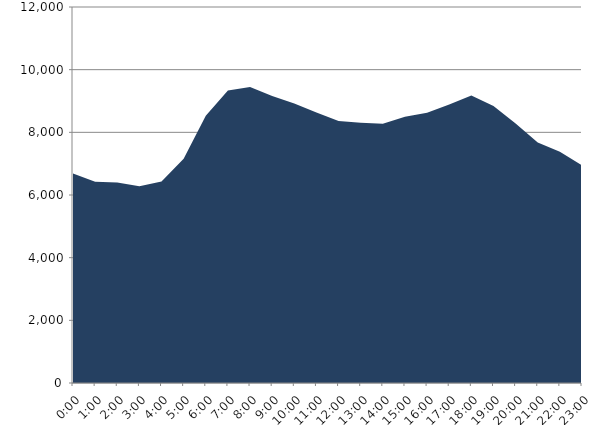
| Category | Series 0 | Series 1 |
|---|---|---|
| 2023-10-18 |  | 6684.831 |
| 2023-10-18 01:00:00 |  | 6426.607 |
| 2023-10-18 02:00:00 |  | 6401.383 |
| 2023-10-18 03:00:00 |  | 6275.612 |
| 2023-10-18 04:00:00 |  | 6433.527 |
| 2023-10-18 05:00:00 |  | 7155.216 |
| 2023-10-18 06:00:00 |  | 8527.05 |
| 2023-10-18 07:00:00 |  | 9336.054 |
| 2023-10-18 08:00:00 |  | 9447.662 |
| 2023-10-18 09:00:00 |  | 9162.402 |
| 2023-10-18 10:00:00 |  | 8923.727 |
| 2023-10-18 11:00:00 |  | 8635.087 |
| 2023-10-18 12:00:00 |  | 8365.264 |
| 2023-10-18 13:00:00 |  | 8305.423 |
| 2023-10-18 14:00:00 |  | 8274.873 |
| 2023-10-18 15:00:00 |  | 8496.261 |
| 2023-10-18 16:00:00 |  | 8621.223 |
| 2023-10-18 17:00:00 |  | 8888.551 |
| 2023-10-18 18:00:00 |  | 9178.778 |
| 2023-10-18 19:00:00 |  | 8841.159 |
| 2023-10-18 20:00:00 |  | 8285.478 |
| 2023-10-18 21:00:00 |  | 7676.717 |
| 2023-10-18 22:00:00 |  | 7379.318 |
| 2023-10-18 23:00:00 |  | 6942.224 |